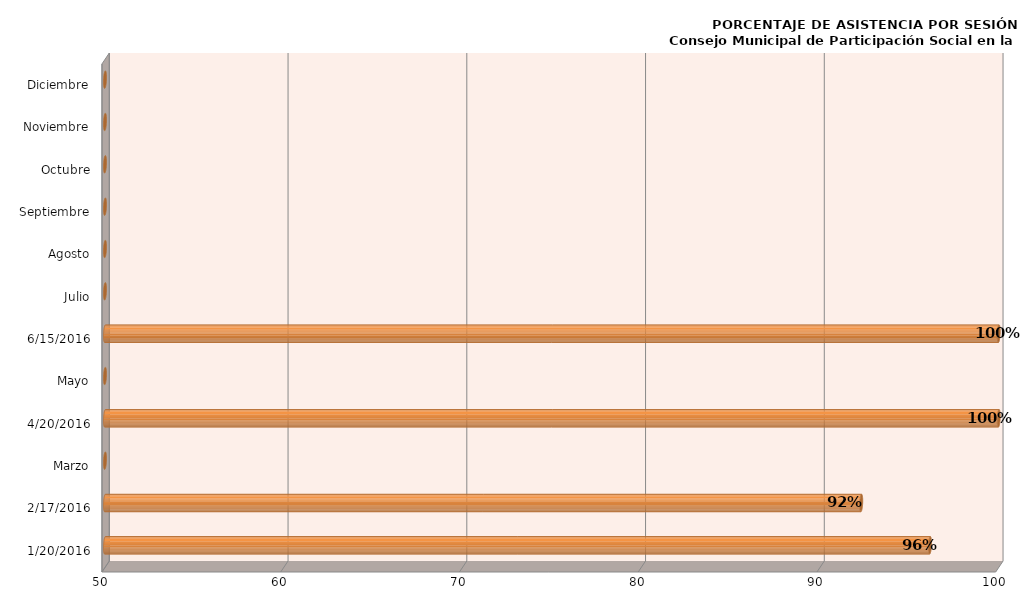
| Category | Series 0 |
|---|---|
| 20/01/2016 | 96.154 |
| 17/02/2016 | 92.308 |
| Marzo | 0 |
| 20/04/2016 | 100 |
| Mayo | 0 |
| 15/06/2016 | 100 |
| Julio | 0 |
| Agosto | 0 |
| Septiembre | 0 |
| Octubre | 0 |
| Noviembre | 0 |
| Diciembre | 0 |